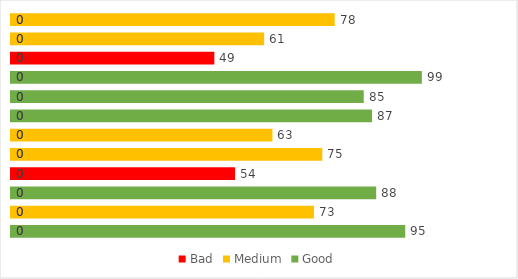
| Category | Bad | Medium | Good |
|---|---|---|---|
| 0 | 0 | 0 | 95 |
| 1 | 0 | 73 | 0 |
| 2 | 0 | 0 | 88 |
| 3 | 54 | 0 | 0 |
| 4 | 0 | 75 | 0 |
| 5 | 0 | 63 | 0 |
| 6 | 0 | 0 | 87 |
| 7 | 0 | 0 | 85 |
| 8 | 0 | 0 | 99 |
| 9 | 49 | 0 | 0 |
| 10 | 0 | 61 | 0 |
| 11 | 0 | 78 | 0 |